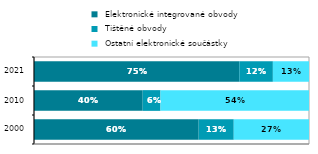
| Category |  Elektronické integrované obvody |  Tištěné obvody |  Ostatní elektronické součástky |
|---|---|---|---|
| 2000.0 | 0.599 | 0.128 | 0.274 |
| 2010.0 | 0.395 | 0.065 | 0.54 |
| 2021.0 | 0.747 | 0.122 | 0.131 |